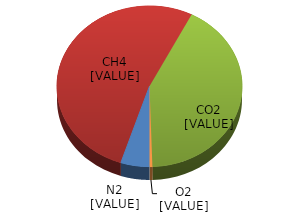
| Category | Series 0 |
|---|---|
| 0 | 0.05 |
| 1 | 0.525 |
| 2 | 0.42 |
| 3 | 0.005 |